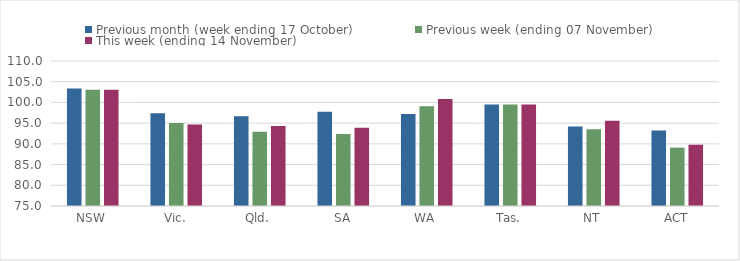
| Category | Previous month (week ending 17 October) | Previous week (ending 07 November) | This week (ending 14 November) |
|---|---|---|---|
| NSW | 103.38 | 103.04 | 103.04 |
| Vic. | 97.36 | 95.04 | 94.66 |
| Qld. | 96.65 | 92.91 | 94.32 |
| SA | 97.73 | 92.35 | 93.87 |
| WA | 97.23 | 99.1 | 100.81 |
| Tas. | 99.49 | 99.49 | 99.49 |
| NT | 94.17 | 93.52 | 95.58 |
| ACT | 93.22 | 89.09 | 89.79 |